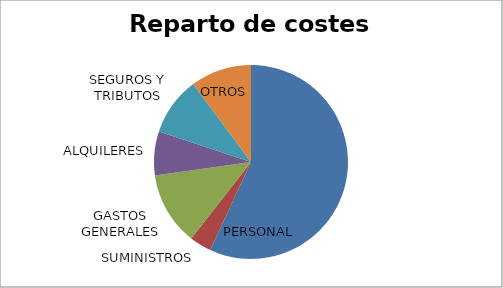
| Category | Series 0 |
|---|---|
| PERSONAL | 140000 |
| SUMINISTROS | 9000 |
| GASTOS GENERALES | 30000 |
| ALQUILERES | 18000 |
| SEGUROS Y TRIBUTOS | 24000 |
| OTROS | 25000 |